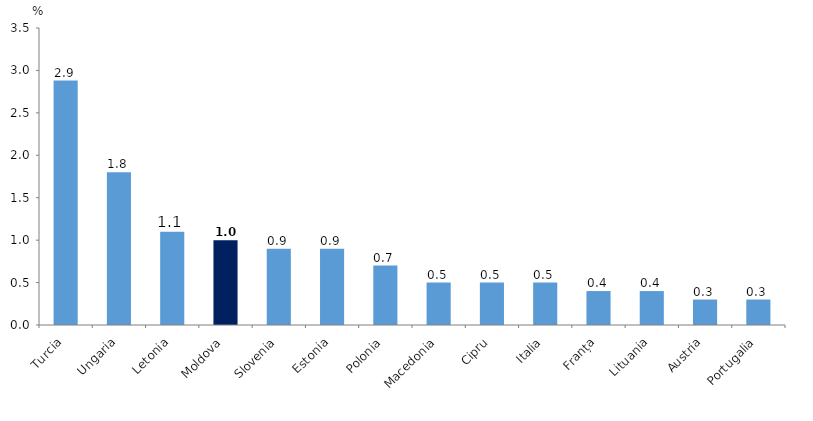
| Category | Series 0 |
|---|---|
| Turcia | 2.88 |
| Ungaria | 1.8 |
| Letonia | 1.1 |
| Moldova | 1 |
| Slovenia | 0.9 |
| Estonia | 0.9 |
| Polonia | 0.7 |
| Macedonia | 0.5 |
| Cipru | 0.5 |
| Italia | 0.5 |
| Franța | 0.4 |
| Lituania | 0.4 |
| Austria | 0.3 |
| Portugalia | 0.3 |